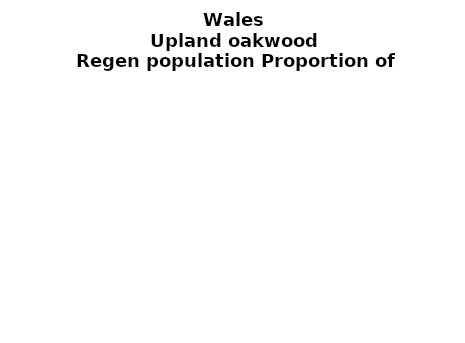
| Category | Upland oakwood |
|---|---|
| None | 0.096 |
| Seedlings only | 0 |
| Seedlings, saplings only | 0.044 |
| Seedlings, saplings, <7 cm trees | 0.213 |
| Saplings only | 0.169 |
| <7 cm trees, seedlings only | 0 |
| <7 cm trees, saplings only | 0.351 |
| <7 cm Trees only | 0.126 |